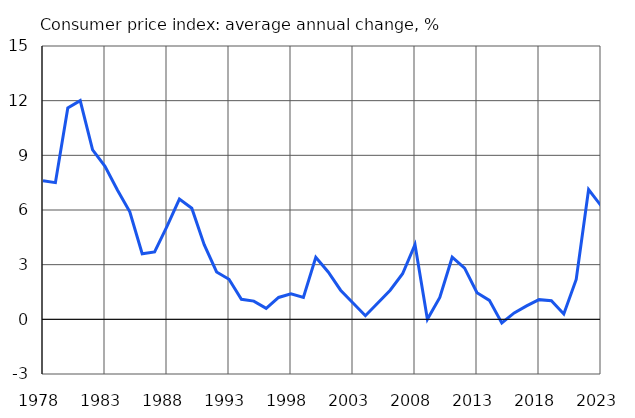
| Category | Consumer price index: average annual change, % |
|---|---|
| 1978.0 | 7.6 |
| 1979.0 | 7.5 |
| 1980.0 | 11.6 |
| 1981.0 | 12 |
| 1982.0 | 9.3 |
| 1983.0 | 8.4 |
| 1984.0 | 7.1 |
| 1985.0 | 5.9 |
| 1986.0 | 3.6 |
| 1987.0 | 3.7 |
| 1988.0 | 5.1 |
| 1989.0 | 6.6 |
| 1990.0 | 6.1 |
| 1991.0 | 4.1 |
| 1992.0 | 2.6 |
| 1993.0 | 2.2 |
| 1994.0 | 1.1 |
| 1995.0 | 1 |
| 1996.0 | 0.6 |
| 1997.0 | 1.2 |
| 1998.0 | 1.4 |
| 1999.0 | 1.2 |
| 2000.0 | 3.4 |
| 2001.0 | 2.6 |
| 2002.0 | 1.6 |
| 2003.0 | 0.9 |
| 2004.0 | 0.2 |
| 2005.0 | 0.9 |
| 2006.0 | 1.6 |
| 2007.0 | 2.5 |
| 2008.0 | 4.1 |
| 2009.0 | 0 |
| 2010.0 | 1.2 |
| 2011.0 | 3.41 |
| 2012.0 | 2.81 |
| 2013.0 | 1.46 |
| 2014.0 | 1.04 |
| 2015.0 | -0.2 |
| 2016.0 | 0.35 |
| 2017.0 | 0.74 |
| 2018.0 | 1.08 |
| 2019.0 | 1.02 |
| 2020.0 | 0.29 |
| 2021.0 | 2.19 |
| 2022.0 | 7.12 |
| 2023.0 | 6.24 |